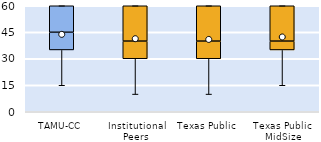
| Category | 25th | 50th | 75th |
|---|---|---|---|
| TAMU-CC | 35 | 10 | 15 |
| Institutional Peers | 30 | 10 | 20 |
| Texas Public | 30 | 10 | 20 |
| Texas Public MidSize | 35 | 5 | 20 |